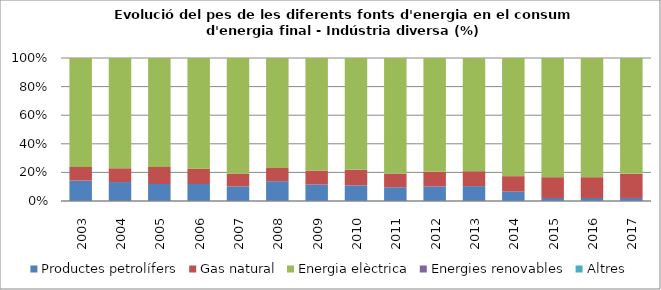
| Category | Productes petrolífers | Gas natural | Energia elèctrica | Energies renovables | Altres |
|---|---|---|---|---|---|
| 2003.0 | 1.2 | 0.8 | 6.4 | 0 | 0 |
| 2004.0 | 1.1 | 0.8 | 6.4 | 0 | 0 |
| 2005.0 | 1 | 1 | 6.4 | 0 | 0 |
| 2006.0 | 1 | 0.9 | 6.5 | 0 | 0 |
| 2007.0 | 0.8 | 0.7 | 6.3 | 0 | 0 |
| 2008.0 | 0.9 | 0.6 | 5 | 0 | 0 |
| 2009.0 | 0.7 | 0.6 | 4.8 | 0 | 0 |
| 2010.0 | 0.6 | 0.6 | 4.3 | 0 | 0 |
| 2011.0 | 0.5 | 0.5 | 4.2 | 0 | 0 |
| 2012.0 | 0.5 | 0.5 | 3.9 | 0 | 0 |
| 2013.0 | 0.5 | 0.5 | 3.8 | 0 | 0 |
| 2014.0 | 0.3 | 0.5 | 3.8 | 0 | 0 |
| 2015.0 | 0.1 | 0.7 | 4 | 0 | 0 |
| 2016.0 | 0.1 | 0.7 | 4 | 0 | 0 |
| 2017.0 | 0.1 | 0.8 | 3.8 | 0 | 0 |